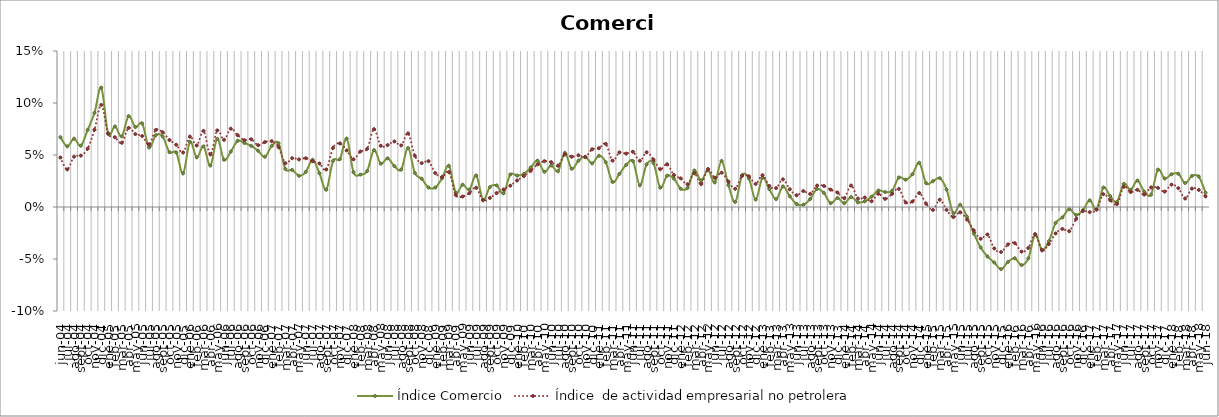
| Category | Índice Comercio | Índice  de actividad empresarial no petrolera |
|---|---|---|
| 2004-01-01 | 0.035 | 0.02 |
| 2004-02-01 | 0.039 | 0.033 |
| 2004-03-01 | 0.079 | 0.056 |
| 2004-04-01 | 0.055 | 0.042 |
| 2004-05-01 | 0.045 | 0.034 |
| 2004-06-01 | 0.067 | 0.048 |
| 2004-07-01 | 0.058 | 0.036 |
| 2004-08-01 | 0.066 | 0.048 |
| 2004-09-01 | 0.059 | 0.049 |
| 2004-10-01 | 0.074 | 0.056 |
| 2004-11-01 | 0.09 | 0.074 |
| 2004-12-01 | 0.115 | 0.098 |
| 2005-01-01 | 0.07 | 0.071 |
| 2005-02-01 | 0.077 | 0.067 |
| 2005-03-01 | 0.068 | 0.062 |
| 2005-04-01 | 0.087 | 0.076 |
| 2005-05-01 | 0.077 | 0.07 |
| 2005-06-01 | 0.08 | 0.068 |
| 2005-07-01 | 0.057 | 0.06 |
| 2005-08-01 | 0.069 | 0.074 |
| 2005-09-01 | 0.068 | 0.072 |
| 2005-10-01 | 0.053 | 0.064 |
| 2005-11-01 | 0.052 | 0.06 |
| 2005-12-01 | 0.032 | 0.052 |
| 2006-01-01 | 0.063 | 0.068 |
| 2006-02-01 | 0.048 | 0.059 |
| 2006-03-01 | 0.058 | 0.073 |
| 2006-04-01 | 0.04 | 0.051 |
| 2006-05-01 | 0.066 | 0.074 |
| 2006-06-01 | 0.045 | 0.065 |
| 2006-07-01 | 0.053 | 0.075 |
| 2006-08-01 | 0.064 | 0.069 |
| 2006-09-01 | 0.062 | 0.064 |
| 2006-10-01 | 0.059 | 0.065 |
| 2006-11-01 | 0.054 | 0.059 |
| 2006-12-01 | 0.048 | 0.062 |
| 2007-01-01 | 0.059 | 0.063 |
| 2007-02-01 | 0.061 | 0.058 |
| 2007-03-01 | 0.037 | 0.042 |
| 2007-04-01 | 0.036 | 0.047 |
| 2007-05-01 | 0.03 | 0.046 |
| 2007-06-01 | 0.034 | 0.047 |
| 2007-07-01 | 0.045 | 0.044 |
| 2007-08-01 | 0.033 | 0.042 |
| 2007-09-01 | 0.017 | 0.036 |
| 2007-10-01 | 0.044 | 0.057 |
| 2007-11-01 | 0.046 | 0.061 |
| 2007-12-01 | 0.066 | 0.054 |
| 2008-01-01 | 0.033 | 0.046 |
| 2008-02-01 | 0.031 | 0.053 |
| 2008-03-01 | 0.035 | 0.056 |
| 2008-04-01 | 0.055 | 0.075 |
| 2008-05-01 | 0.042 | 0.059 |
| 2008-06-01 | 0.047 | 0.06 |
| 2008-07-01 | 0.039 | 0.063 |
| 2008-08-01 | 0.036 | 0.059 |
| 2008-09-01 | 0.057 | 0.071 |
| 2008-10-01 | 0.033 | 0.049 |
| 2008-11-01 | 0.027 | 0.042 |
| 2008-12-01 | 0.019 | 0.044 |
| 2009-01-01 | 0.019 | 0.033 |
| 2009-02-01 | 0.028 | 0.029 |
| 2009-03-01 | 0.04 | 0.033 |
| 2009-04-01 | 0.014 | 0.012 |
| 2009-05-01 | 0.021 | 0.01 |
| 2009-06-01 | 0.017 | 0.013 |
| 2009-07-01 | 0.03 | 0.019 |
| 2009-08-01 | 0.007 | 0.006 |
| 2009-09-01 | 0.019 | 0.009 |
| 2009-10-01 | 0.021 | 0.013 |
| 2009-11-01 | 0.013 | 0.017 |
| 2009-12-01 | 0.031 | 0.02 |
| 2010-01-01 | 0.03 | 0.026 |
| 2010-02-01 | 0.032 | 0.03 |
| 2010-03-01 | 0.038 | 0.035 |
| 2010-04-01 | 0.045 | 0.041 |
| 2010-05-01 | 0.034 | 0.044 |
| 2010-06-01 | 0.04 | 0.043 |
| 2010-07-01 | 0.034 | 0.04 |
| 2010-08-01 | 0.052 | 0.051 |
| 2010-09-01 | 0.037 | 0.048 |
| 2010-10-01 | 0.045 | 0.05 |
| 2010-11-01 | 0.048 | 0.048 |
| 2010-12-01 | 0.042 | 0.055 |
| 2011-01-01 | 0.049 | 0.057 |
| 2011-02-01 | 0.043 | 0.061 |
| 2011-03-01 | 0.024 | 0.045 |
| 2011-04-01 | 0.032 | 0.053 |
| 2011-05-01 | 0.04 | 0.051 |
| 2011-06-01 | 0.044 | 0.053 |
| 2011-07-01 | 0.021 | 0.044 |
| 2011-08-01 | 0.041 | 0.053 |
| 2011-09-01 | 0.042 | 0.046 |
| 2011-10-01 | 0.019 | 0.036 |
| 2011-11-01 | 0.03 | 0.041 |
| 2011-12-01 | 0.027 | 0.031 |
| 2012-01-01 | 0.018 | 0.028 |
| 2012-02-01 | 0.018 | 0.022 |
| 2012-03-01 | 0.035 | 0.032 |
| 2012-04-01 | 0.025 | 0.022 |
| 2012-05-01 | 0.035 | 0.037 |
| 2012-06-01 | 0.024 | 0.028 |
| 2012-07-01 | 0.044 | 0.033 |
| 2012-08-01 | 0.021 | 0.024 |
| 2012-09-01 | 0.005 | 0.018 |
| 2012-10-01 | 0.03 | 0.03 |
| 2012-11-01 | 0.027 | 0.03 |
| 2012-12-01 | 0.007 | 0.022 |
| 2013-01-01 | 0.028 | 0.031 |
| 2013-02-01 | 0.017 | 0.02 |
| 2013-03-01 | 0.008 | 0.018 |
| 2013-04-01 | 0.02 | 0.027 |
| 2013-05-01 | 0.01 | 0.017 |
| 2013-06-01 | 0.003 | 0.011 |
| 2013-07-01 | 0.002 | 0.015 |
| 2013-08-01 | 0.008 | 0.013 |
| 2013-09-01 | 0.017 | 0.021 |
| 2013-10-01 | 0.014 | 0.02 |
| 2013-11-01 | 0.004 | 0.017 |
| 2013-12-01 | 0.009 | 0.014 |
| 2014-01-01 | 0.004 | 0.008 |
| 2014-02-01 | 0.01 | 0.021 |
| 2014-03-01 | 0.004 | 0.008 |
| 2014-04-01 | 0.005 | 0.009 |
| 2014-05-01 | 0.01 | 0.006 |
| 2014-06-01 | 0.016 | 0.013 |
| 2014-07-01 | 0.014 | 0.008 |
| 2014-08-01 | 0.016 | 0.013 |
| 2014-09-01 | 0.028 | 0.017 |
| 2014-10-01 | 0.026 | 0.004 |
| 2014-11-01 | 0.032 | 0.005 |
| 2014-12-01 | 0.042 | 0.013 |
| 2015-01-01 | 0.023 | 0.003 |
| 2015-02-01 | 0.025 | -0.003 |
| 2015-03-01 | 0.028 | 0.007 |
| 2015-04-01 | 0.017 | -0.003 |
| 2015-05-01 | -0.006 | -0.01 |
| 2015-06-01 | 0.002 | -0.005 |
| 2015-07-01 | -0.009 | -0.012 |
| 2015-08-01 | -0.025 | -0.023 |
| 2015-09-01 | -0.039 | -0.031 |
| 2015-10-01 | -0.048 | -0.026 |
| 2015-11-01 | -0.053 | -0.04 |
| 2015-12-01 | -0.06 | -0.043 |
| 2016-01-01 | -0.053 | -0.036 |
| 2016-02-01 | -0.049 | -0.035 |
| 2016-03-01 | -0.056 | -0.043 |
| 2016-04-01 | -0.049 | -0.039 |
| 2016-05-01 | -0.027 | -0.026 |
| 2016-06-01 | -0.041 | -0.042 |
| 2016-07-01 | -0.033 | -0.036 |
| 2016-08-01 | -0.015 | -0.025 |
| 2016-09-01 | -0.01 | -0.021 |
| 2016-10-01 | -0.002 | -0.023 |
| 2016-11-01 | -0.008 | -0.012 |
| 2016-12-01 | -0.003 | -0.004 |
| 2017-01-01 | 0.006 | -0.005 |
| 2017-02-01 | -0.002 | -0.003 |
| 2017-03-01 | 0.019 | 0.012 |
| 2017-04-01 | 0.011 | 0.007 |
| 2017-05-01 | 0.005 | 0.003 |
| 2017-06-01 | 0.022 | 0.019 |
| 2017-07-01 | 0.017 | 0.014 |
| 2017-08-01 | 0.025 | 0.016 |
| 2017-09-01 | 0.015 | 0.012 |
| 2017-10-01 | 0.012 | 0.019 |
| 2017-11-01 | 0.036 | 0.018 |
| 2017-12-01 | 0.027 | 0.015 |
| 2018-01-01 | 0.031 | 0.021 |
| 2018-02-01 | 0.032 | 0.018 |
| 2018-03-01 | 0.023 | 0.008 |
| 2018-04-01 | 0.03 | 0.018 |
| 2018-05-01 | 0.029 | 0.016 |
| 2018-06-01 | 0.014 | 0.01 |